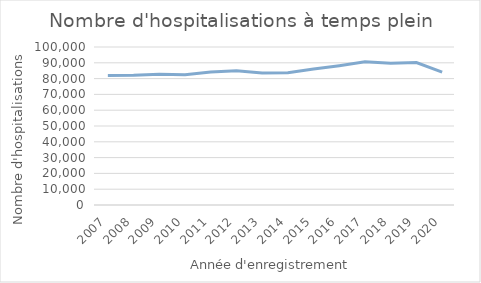
| Category | Nombre de séjours |
|---|---|
| 2007.0 | 82037 |
| 2008.0 | 82088 |
| 2009.0 | 82750 |
| 2010.0 | 82401 |
| 2011.0 | 84193 |
| 2012.0 | 85026 |
| 2013.0 | 83614 |
| 2014.0 | 83762 |
| 2015.0 | 86100 |
| 2016.0 | 88204 |
| 2017.0 | 90594 |
| 2018.0 | 89733 |
| 2019.0 | 90176 |
| 2020.0 | 84114 |